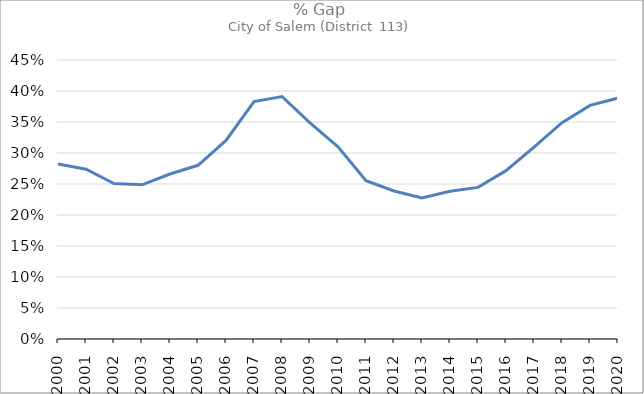
| Category | Series 0 |
|---|---|
| 2000.0 | 0.282 |
| 2001.0 | 0.274 |
| 2002.0 | 0.251 |
| 2003.0 | 0.249 |
| 2004.0 | 0.266 |
| 2005.0 | 0.28 |
| 2006.0 | 0.32 |
| 2007.0 | 0.383 |
| 2008.0 | 0.391 |
| 2009.0 | 0.348 |
| 2010.0 | 0.31 |
| 2011.0 | 0.255 |
| 2012.0 | 0.239 |
| 2013.0 | 0.228 |
| 2014.0 | 0.238 |
| 2015.0 | 0.245 |
| 2016.0 | 0.272 |
| 2017.0 | 0.31 |
| 2018.0 | 0.349 |
| 2019.0 | 0.377 |
| 2020.0 | 0.389 |